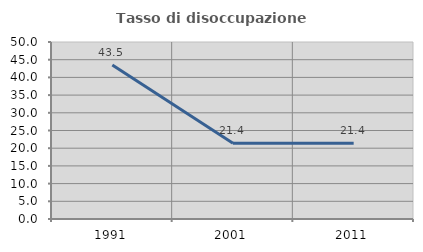
| Category | Tasso di disoccupazione giovanile  |
|---|---|
| 1991.0 | 43.478 |
| 2001.0 | 21.429 |
| 2011.0 | 21.429 |